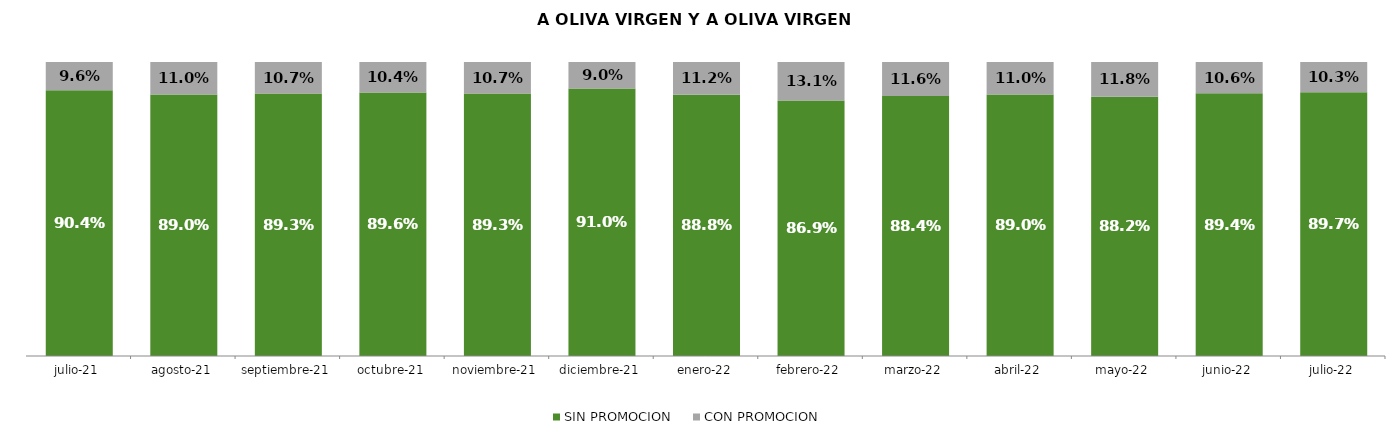
| Category | SIN PROMOCION   | CON PROMOCION   |
|---|---|---|
| 2021-07-01 | 0.904 | 0.096 |
| 2021-08-01 | 0.89 | 0.11 |
| 2021-09-01 | 0.893 | 0.107 |
| 2021-10-01 | 0.896 | 0.104 |
| 2021-11-01 | 0.893 | 0.107 |
| 2021-12-01 | 0.91 | 0.09 |
| 2022-01-01 | 0.888 | 0.112 |
| 2022-02-01 | 0.869 | 0.131 |
| 2022-03-01 | 0.884 | 0.116 |
| 2022-04-01 | 0.89 | 0.11 |
| 2022-05-01 | 0.882 | 0.118 |
| 2022-06-01 | 0.894 | 0.106 |
| 2022-07-01 | 0.897 | 0.103 |